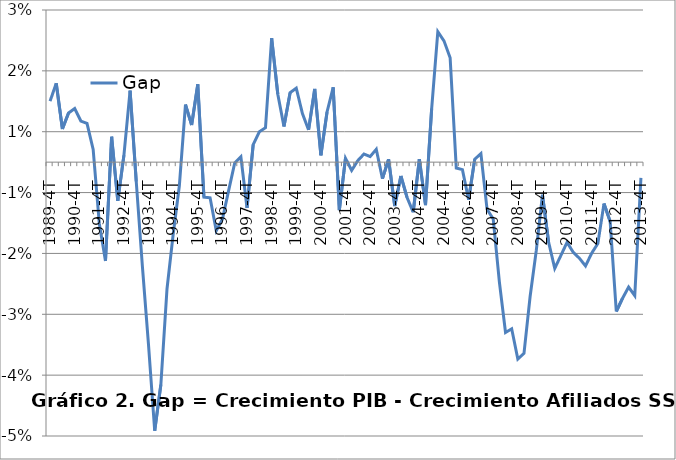
| Category | Gap |
|---|---|
| 1989-4T | 0.01 |
| 1990-1T | 0.013 |
| 1990-2T | 0.005 |
| 1990-3T | 0.008 |
| 1990-4T | 0.009 |
| 1991-1T | 0.007 |
| 1991-2T | 0.006 |
| 1991-3T | 0.002 |
| 1991-4T | -0.01 |
| 1992-1T | -0.016 |
| 1992-2T | 0.004 |
| 1992-3T | -0.006 |
| 1992-4T | 0.001 |
| 1993-1T | 0.012 |
| 1993-2T | -0.003 |
| 1993-3T | -0.017 |
| 1993-4T | -0.03 |
| 1994-1T | -0.044 |
| 1994-2T | -0.037 |
| 1994-3T | -0.021 |
| 1994-4T | -0.012 |
| 1995-1T | -0.004 |
| 1995-2T | 0.009 |
| 1995-3T | 0.006 |
| 1995-4T | 0.013 |
| 1996-1T | -0.006 |
| 1996-2T | -0.006 |
| 1996-3T | -0.011 |
| 1996-4T | -0.009 |
| 1997-1T | -0.005 |
| 1997-2T | 0 |
| 1997-3T | 0.001 |
| 1997-4T | -0.008 |
| 1998-1T | 0.003 |
| 1998-2T | 0.005 |
| 1998-3T | 0.006 |
| 1998-4T | 0.02 |
| 1999-1T | 0.011 |
| 1999-2T | 0.006 |
| 1999-3T | 0.011 |
| 1999-4T | 0.012 |
| 2000-1T | 0.008 |
| 2000-2T | 0.005 |
| 2000-3T | 0.012 |
| 2000-4T | 0.001 |
| 2001-1T | 0.008 |
| 2001-2T | 0.012 |
| 2001-3T | -0.008 |
| 2001-4T | 0.001 |
| 2002-1T | -0.001 |
| 2002-2T | 0 |
| 2002-3T | 0.001 |
| 2002-4T | 0.001 |
| 2003-1T | 0.002 |
| 2003-2T | -0.003 |
| 2003-3T | 0 |
| 2003-4T | -0.007 |
| 2004-1T | -0.002 |
| 2004-2T | -0.006 |
| 2004-3T | -0.008 |
| 2004-4T | 0.001 |
| 2004-1T | -0.007 |
| 2004-2T | 0.009 |
| 2004-3T | 0.021 |
| 2004-4T | 0.02 |
| 2006-1T | 0.017 |
| 2006-2T | -0.001 |
| 2006-3T | -0.001 |
| 2006-4T | -0.006 |
| 2007-1T | 0 |
| 2007-2T | 0.001 |
| 2007-3T | -0.008 |
| 2007-4T | -0.009 |
| 2008-1T | -0.02 |
| 2008-2T | -0.028 |
| 2008-3T | -0.027 |
| 2008-4T | -0.032 |
| 2009-1T | -0.031 |
| 2009-2T | -0.022 |
| 2009-3T | -0.014 |
| 2009-4T | -0.005 |
| 2010-1T | -0.013 |
| 2010-2T | -0.017 |
| 2010-3T | -0.015 |
| 2010-4T | -0.013 |
| 2011-1T | -0.015 |
| 2011-2T | -0.016 |
| 2011-3T | -0.017 |
| 2011-4T | -0.015 |
| 2012-1T | -0.013 |
| 2012-2T | -0.007 |
| 2012-3T | -0.01 |
| 2012-4T | -0.025 |
| 2013-1T | -0.022 |
| 2013-2T | -0.021 |
| 2013-3T | -0.022 |
| 2013-4T | -0.003 |